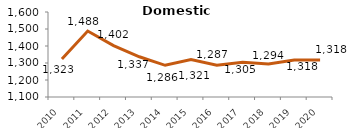
| Category | Domestico |
|---|---|
| 2010.0 | 1323.2 |
| 2011.0 | 1487.9 |
| 2012.0 | 1402.2 |
| 2013.0 | 1336.7 |
| 2014.0 | 1286.4 |
| 2015.0 | 1320.9 |
| 2016.0 | 1286.6 |
| 2017.0 | 1304.8 |
| 2018.0 | 1294.2 |
| 2019.0 | 1318.1 |
| 2020.0 | 1317.7 |